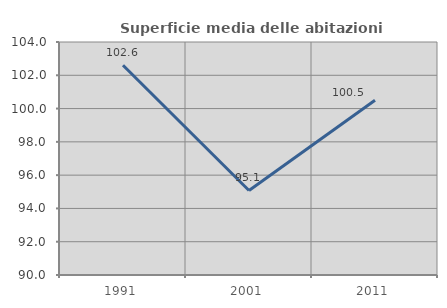
| Category | Superficie media delle abitazioni occupate |
|---|---|
| 1991.0 | 102.603 |
| 2001.0 | 95.08 |
| 2011.0 | 100.503 |